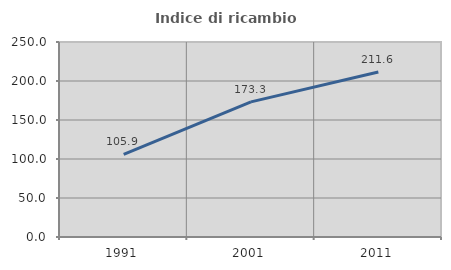
| Category | Indice di ricambio occupazionale  |
|---|---|
| 1991.0 | 105.864 |
| 2001.0 | 173.273 |
| 2011.0 | 211.55 |